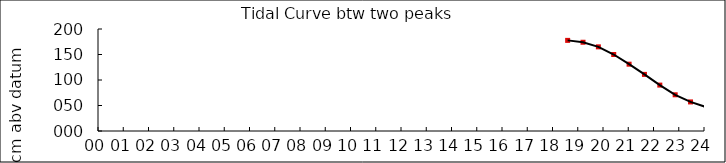
| Category | Height cm |
|---|---|
| 18.6 | 177.687 |
| 19.20833333333334 | 174 |
| 19.81666666666667 | 165 |
| 20.425 | 150 |
| 21.03333333333333 | 131 |
| 21.64166666666667 | 111 |
| 22.25 | 90 |
| 22.85833333333333 | 71 |
| 23.46666666666667 | 57 |
| 24.075 | 47 |
| 24.68333333333333 | 44 |